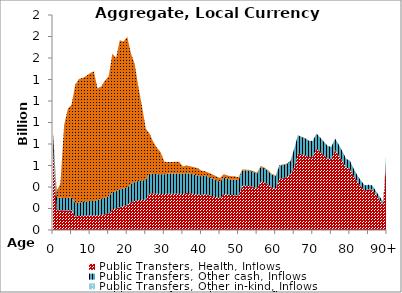
| Category | Public Transfers, Health, Inflows | Public Transfers, Other cash, Inflows | Public Transfers, Other in-kind, Inflows | Public Transfers, Education, Inflows |
|---|---|---|---|---|
| 0 | 769.989 | 123.963 |  | 12.475 |
|  | 185.89 | 118.667 |  | 55.955 |
| 2 | 182.954 | 116.44 |  | 132.729 |
| 3 | 181.924 | 115.538 |  | 678.549 |
| 4 | 182.538 | 116.056 |  | 829.075 |
| 5 | 185.172 | 118.052 |  | 862.901 |
| 6 | 126.912 | 121.289 |  | 1102.696 |
| 7 | 129.916 | 124.704 |  | 1150.791 |
| 8 | 132.584 | 127.821 |  | 1153.755 |
| 9 | 134.891 | 130.615 |  | 1168.632 |
| 10 | 137 | 133.234 |  | 1189.958 |
| 11 | 134.173 | 136.094 |  | 1206.153 |
| 12 | 137.503 | 140.301 |  | 1038.774 |
| 13 | 141.68 | 145.724 |  | 1047.071 |
| 14 | 146.664 | 152.212 |  | 1093.274 |
| 15 | 152.731 | 160.265 |  | 1114.728 |
| 16 | 191.945 | 159.946 |  | 1287.935 |
| 17 | 201.475 | 159.382 |  | 1241.084 |
| 18 | 211.417 | 166.133 |  | 1387.77 |
| 19 | 222.162 | 164.337 |  | 1366.792 |
| 20 | 233 | 161.053 |  | 1403.921 |
| 21 | 261.11 | 168.042 |  | 1214.035 |
| 22 | 270.435 | 174.237 |  | 1103.046 |
| 23 | 277.338 | 178.787 |  | 876.435 |
| 24 | 281.267 | 181.419 |  | 684.291 |
| 25 | 282.713 | 182.456 |  | 478.185 |
| 26 | 342.719 | 182.283 |  | 373.32 |
| 27 | 340.63 | 181.015 |  | 299.055 |
| 28 | 338.006 | 181.837 |  | 245.103 |
| 29 | 335.733 | 182.816 |  | 204.67 |
| 30 | 334.288 | 184.165 |  | 116.147 |
| 31 | 338.617 | 185.96 |  | 107.476 |
| 32 | 337.92 | 187.816 |  | 107.476 |
| 33 | 338.494 | 188.024 |  | 107.476 |
| 34 | 338.46 | 187.926 |  | 107.476 |
| 35 | 335.343 | 186.111 |  | 69.635 |
| 36 | 346.399 | 183.465 |  | 69.635 |
| 37 | 341.81 | 180.991 |  | 69.635 |
| 38 | 336.19 | 178.564 |  | 69.635 |
| 39 | 330.219 | 175.923 |  | 69.635 |
| 40 | 325.536 | 173.854 |  | 52.873 |
| 41 | 333.806 | 171.274 |  | 41.015 |
| 42 | 325.125 | 167.251 |  | 40.302 |
| 43 | 314.777 | 161.821 |  | 39.597 |
| 44 | 304.835 | 156.61 |  | 38.888 |
| 45 | 296.365 | 152.26 |  | 34.239 |
| 46 | 337.603 | 148.42 |  | 33.529 |
| 47 | 329.591 | 144.899 |  | 32.82 |
| 48 | 324.715 | 143.465 |  | 32.112 |
| 49 | 324.144 | 143.909 |  | 31.402 |
| 50 | 321.929 | 143.618 |  | 24.257 |
| 51 | 412.357 | 142.448 |  | 8.915 |
| 52 | 410.928 | 142.654 |  | 8.206 |
| 53 | 408.522 | 142.777 |  | 7.493 |
| 54 | 399.978 | 140.742 |  | 6.788 |
| 55 | 387.596 | 137.308 |  | 9.535 |
| 56 | 454.687 | 132.958 |  | 8.822 |
| 57 | 442.158 | 130.086 |  | 8.117 |
| 58 | 422.86 | 125.806 |  | 7.408 |
| 59 | 395.354 | 118.953 |  | 6.699 |
| 60 | 383.599 | 116.687 |  | 5.989 |
| 61 | 478.002 | 120.073 |  | 5.281 |
| 62 | 482.406 | 122.717 |  | 5.281 |
| 63 | 493.374 | 120.208 |  | 5.281 |
| 64 | 519.155 | 120.952 |  | 5.281 |
| 65 | 582.497 | 174.011 |  | 1.579 |
| 66 | 712.26 | 168.605 |  | 1.579 |
| 67 | 704.502 | 161.311 |  | 1.579 |
| 68 | 694.936 | 157.377 |  | 1.579 |
| 69 | 678.08 | 151.767 |  | 1.579 |
| 70 | 681.826 | 144.781 |  | 1.579 |
| 71 | 759.507 | 137.846 |  | 0 |
| 72 | 728.973 | 130.859 |  | 0 |
| 73 | 696.403 | 124.587 |  | 0 |
| 74 | 663.865 | 118.365 |  | 0 |
| 75 | 660.178 | 112.299 |  | 0 |
| 76 | 744.668 | 105.919 |  | 0 |
| 77 | 695.548 | 98.669 |  | 0 |
| 78 | 639.88 | 90.72 |  | 0 |
| 79 | 579.664 | 82.197 |  | 0 |
| 80 | 570.934 | 73.688 |  | 0 |
| 81 | 506.19 | 65.443 |  | 0 |
| 82 | 450.412 | 58.175 |  | 0 |
| 83 | 405.62 | 52.613 |  | 0 |
| 84 | 367.289 | 47.836 |  | 0 |
| 85 | 377.262 | 43.102 |  | 0 |
| 86 | 376.908 | 38.514 |  | 0 |
| 87 | 330.196 | 33.845 |  | 0 |
| 88 | 282.669 | 29.09 |  | 0 |
| 89 | 236.401 | 24.419 |  | 0 |
| 90+ | 766.375 | 78.437 |  | 0 |